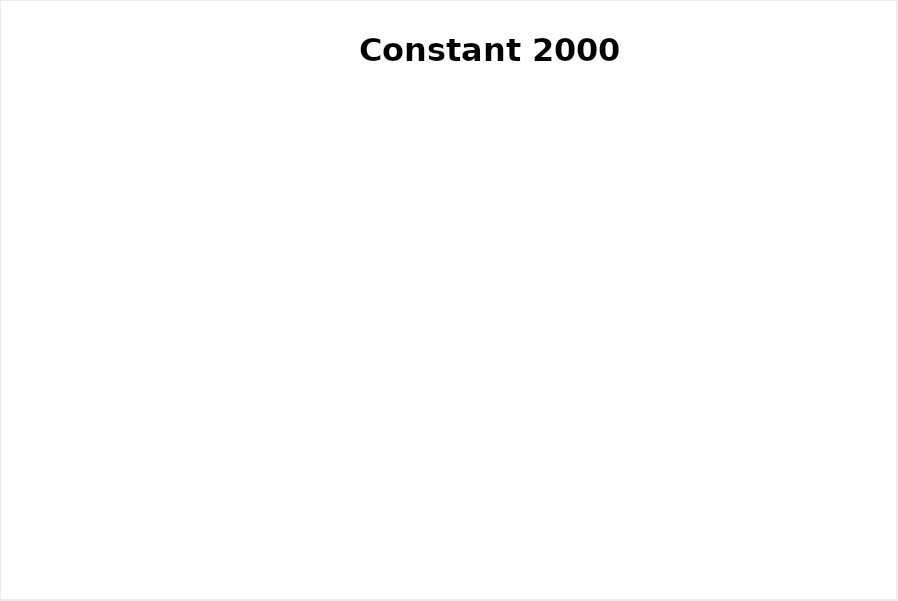
| Category | Series 0 | Series 1 |
|---|---|---|
| Crops | 0 | 51.018 |
| Livestock | 0 | 17.951 |
| Poultry | 0 | 13.367 |
| Fisheries | 0 | 17.665 |